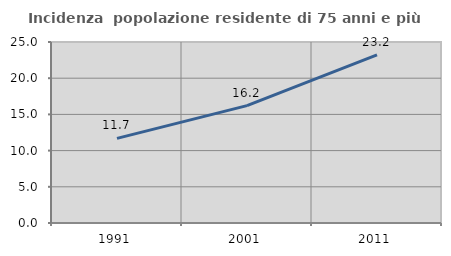
| Category | Incidenza  popolazione residente di 75 anni e più |
|---|---|
| 1991.0 | 11.683 |
| 2001.0 | 16.213 |
| 2011.0 | 23.216 |